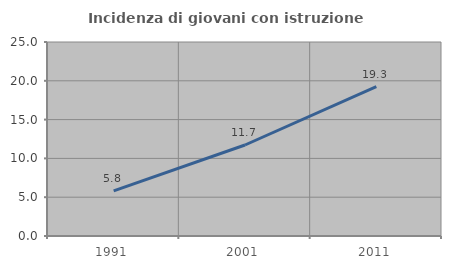
| Category | Incidenza di giovani con istruzione universitaria |
|---|---|
| 1991.0 | 5.818 |
| 2001.0 | 11.727 |
| 2011.0 | 19.25 |